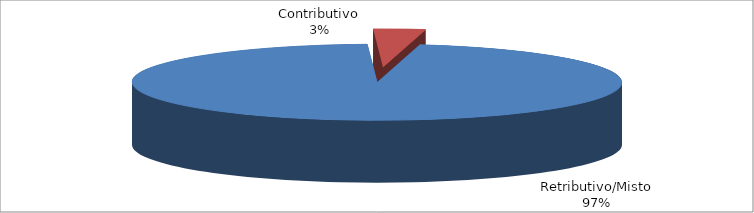
| Category | Series 1 |
|---|---|
| Retributivo/Misto | 61457 |
| Contributivo | 2173 |